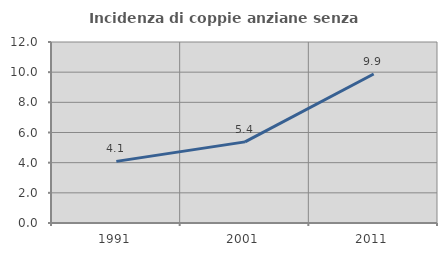
| Category | Incidenza di coppie anziane senza figli  |
|---|---|
| 1991.0 | 4.087 |
| 2001.0 | 5.378 |
| 2011.0 | 9.878 |